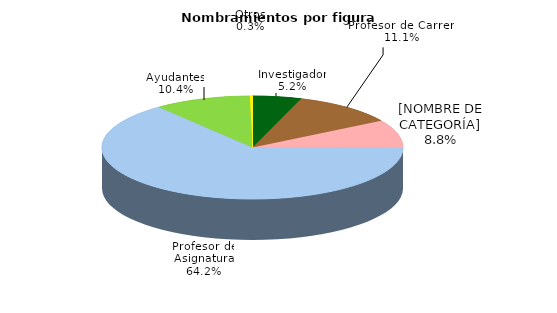
| Category | Series 0 |
|---|---|
| Investigador | 2716 |
| Profesor de Carrera | 5755 |
| Técnico Académico | 4597 |
| Profesor de Asignatura | 33336 |
| Ayudantes | 5389 |
| Otros | 150 |